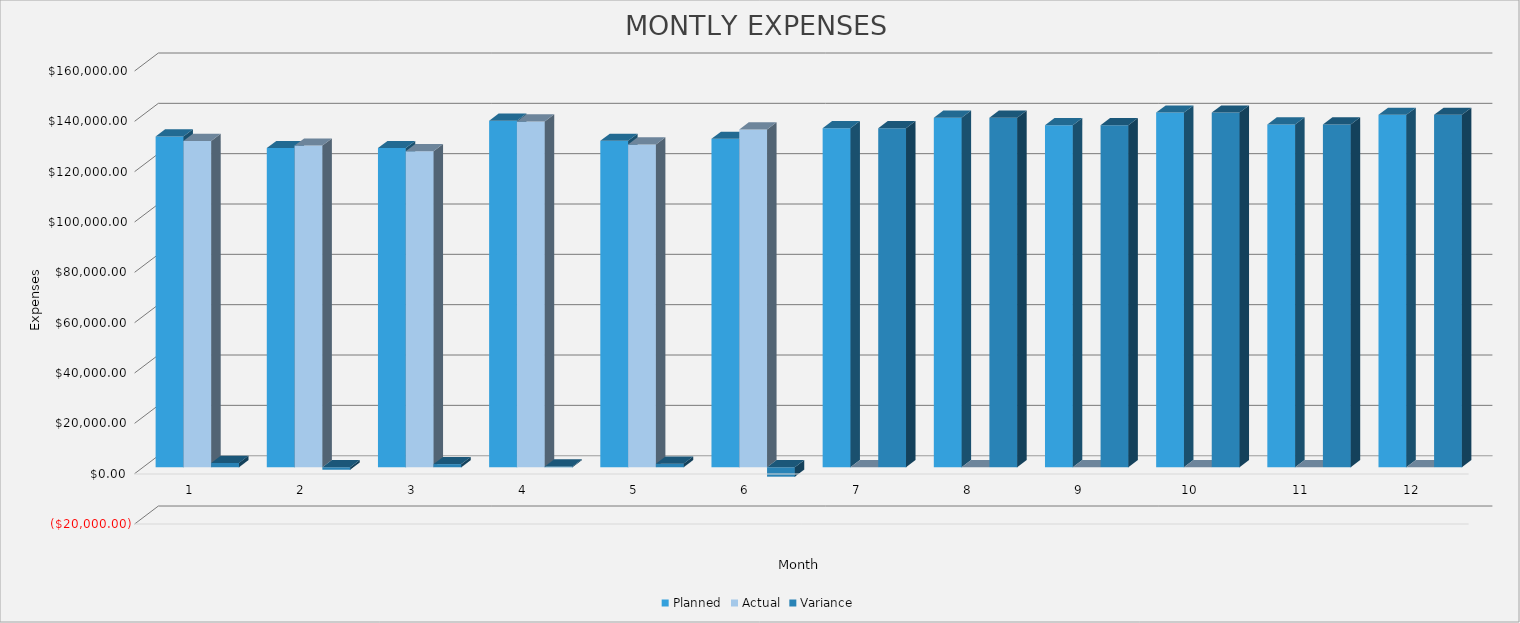
| Category | Planned | Actual | Variance |
|---|---|---|---|
| 0 | 131420 | 129682 | 1738 |
| 1 | 126820 | 127804 | -984 |
| 2 | 126820 | 125565 | 1255 |
| 3 | 137695 | 137394 | 301 |
| 4 | 129695 | 128255 | 1440 |
| 5 | 130495 | 134239 | -3744 |
| 6 | 134695 | 0 | 134695 |
| 7 | 138918 | 0 | 138918 |
| 8 | 135918 | 0 | 135918 |
| 9 | 140918 | 0 | 140918 |
| 10 | 136218 | 0 | 136218 |
| 11 | 140018 | 0 | 140018 |